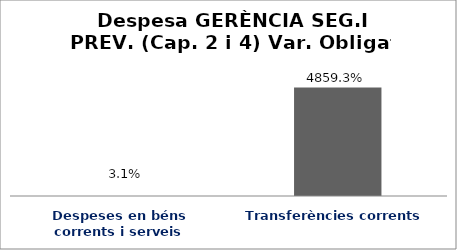
| Category | Series 0 |
|---|---|
| Despeses en béns corrents i serveis | 0.031 |
| Transferències corrents | 48.593 |